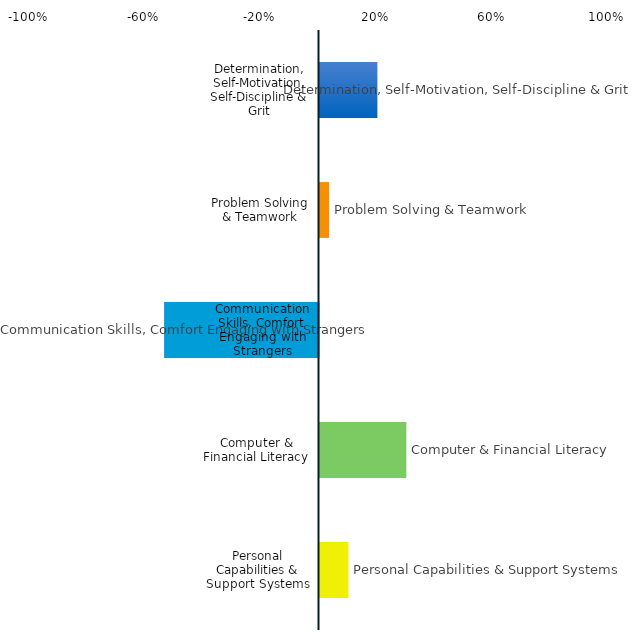
| Category | Series 0 |
|---|---|
| Determination, Self-Motivation, Self-Discipline & Grit | 0.2 |
| Problem Solving & Teamwork | 0.033 |
| Communication Skills, Comfort Engaging with Strangers | -0.533 |
| Computer & Financial Literacy | 0.3 |
| Personal Capabilities & Support Systems | 0.1 |